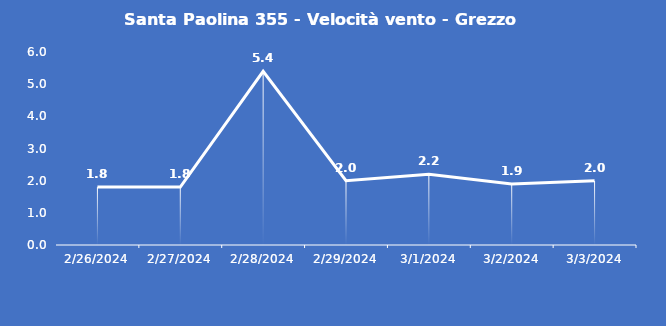
| Category | Santa Paolina 355 - Velocità vento - Grezzo (m/s) |
|---|---|
| 2/26/24 | 1.8 |
| 2/27/24 | 1.8 |
| 2/28/24 | 5.4 |
| 2/29/24 | 2 |
| 3/1/24 | 2.2 |
| 3/2/24 | 1.9 |
| 3/3/24 | 2 |